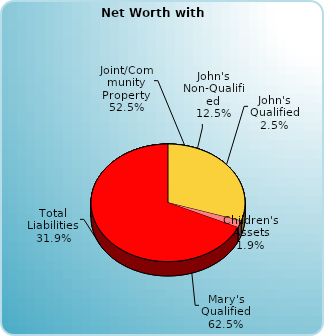
| Category | Series 0 |
|---|---|
| John's Non-Qualified | 125000 |
| John's Qualified | 25000 |
| Mary's Non-Qualified | 0 |
| Mary's Qualified | 625000 |
| Joint/Community Property  | 525000 |
| Children's Assets | 19000 |
| Total Liabilities | -319000 |